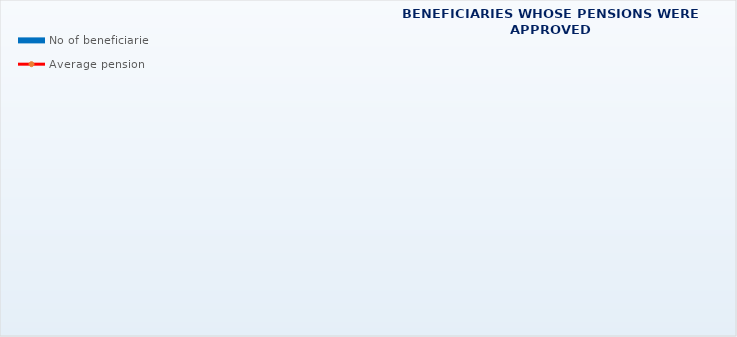
| Category | No of beneficiaries |
|---|---|
| Authorised officials in internal affairs, judicial officers and workers engaged in demining work: | 17264 |
| Pension beneficiaries entitled under the Fire Services Act (Official Gazette 125/19) | 322 |
| Active military personnel - DVO  | 16076 |
| Croatian Homeland Army veterans mobilised from 1941 to 1945 | 2091 |
| Former political prisoners | 2165 |
| Croatian Veterans from the Homeland War - ZOHBDR (Act on Croatian Homeland War Veterans and Their Family Members) | 71365 |
| Pensions approved under general regulations and determined according to the Act on the Rights of Croatian Homeland War Veterans and their Family Members (ZOHBDR), in 2017 (Art. 27, 35, 48 and 49, paragraph 2)    | 57013 |
| Former Yugoslav People's Army members - JNA   | 3868 |
| Former Yugoslav People's Army members - JNA - Art. 185 of Pension Insurance Act (ZOMO)  | 159 |
| National Liberation War veterans - NOR | 5347 |
| Members of the Croatian Parliament, members of the Government, judges of the Constitutional Court and the Auditor General | 685 |
| Members of the Parliamentary Executive Council and administratively retired federal civil servants  (relates to the former SFRY) | 68 |
| Former officials of federal bodies o the former SFRJ -  Article 38 of the Pension Insurance Act (ZOMO) | 19 |
| Full members of the Croatian Academy of Sciences and Arts - HAZU | 127 |
| Miners from the Istrian coal mines "Tupljak" d.d. Labin  | 248 |
| Workers professionally exposed to asbestos | 826 |
| Insurees - crew members on a ship in international and national navigation  - Article  129, paragraph 2 of the Maritime Code | 201 |
| Members of the Croatian Defence Council - HVO  | 6755 |